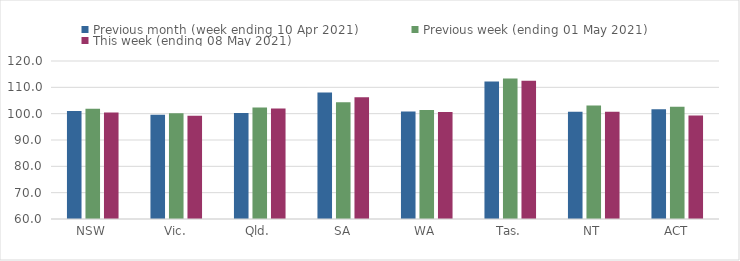
| Category | Previous month (week ending 10 Apr 2021) | Previous week (ending 01 May 2021) | This week (ending 08 May 2021) |
|---|---|---|---|
| NSW | 100.98 | 101.91 | 100.46 |
| Vic. | 99.55 | 100.14 | 99.2 |
| Qld. | 100.28 | 102.35 | 101.96 |
| SA | 108.02 | 104.35 | 106.25 |
| WA | 100.87 | 101.38 | 100.65 |
| Tas. | 112.24 | 113.34 | 112.51 |
| NT | 100.74 | 103.13 | 100.74 |
| ACT | 101.7 | 102.59 | 99.28 |